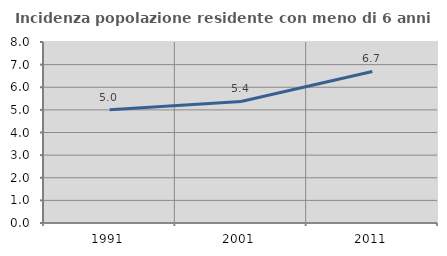
| Category | Incidenza popolazione residente con meno di 6 anni |
|---|---|
| 1991.0 | 5.002 |
| 2001.0 | 5.372 |
| 2011.0 | 6.697 |